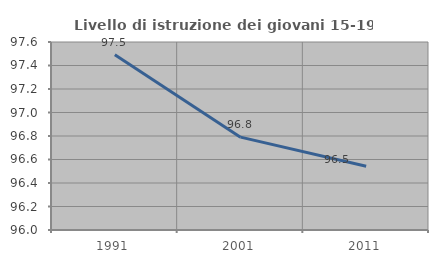
| Category | Livello di istruzione dei giovani 15-19 anni |
|---|---|
| 1991.0 | 97.492 |
| 2001.0 | 96.79 |
| 2011.0 | 96.543 |